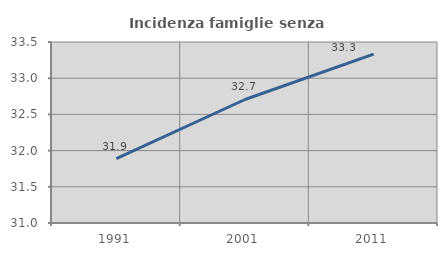
| Category | Incidenza famiglie senza nuclei |
|---|---|
| 1991.0 | 31.888 |
| 2001.0 | 32.706 |
| 2011.0 | 33.333 |